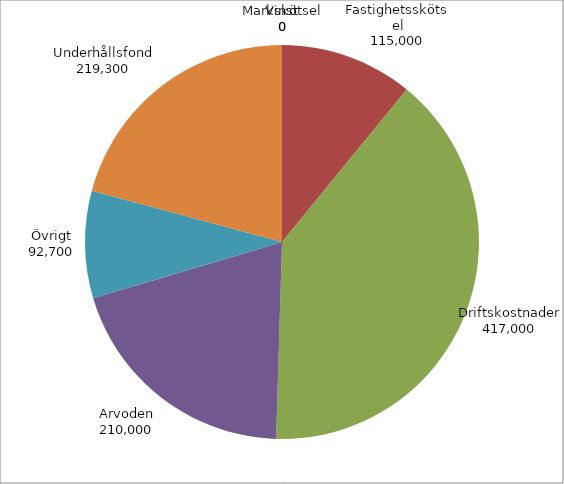
| Category | Series 0 |
|---|---|
| Markskötsel | 0 |
| Fastighetsskötsel | 115000 |
| Driftskostnader | 417000 |
| Arvoden | 210000 |
| Övrigt | 92700 |
| Underhållsfond | 219300 |
| Vinst | 0 |